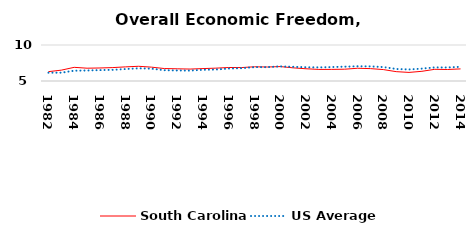
| Category | South Carolina | US Average |
|---|---|---|
| 1982.0 | 6.299 | 6.149 |
| 1983.0 | 6.507 | 6.152 |
| 1984.0 | 6.897 | 6.429 |
| 1985.0 | 6.779 | 6.464 |
| 1986.0 | 6.808 | 6.512 |
| 1987.0 | 6.862 | 6.552 |
| 1988.0 | 6.963 | 6.659 |
| 1989.0 | 7.043 | 6.767 |
| 1990.0 | 6.924 | 6.71 |
| 1991.0 | 6.731 | 6.502 |
| 1992.0 | 6.693 | 6.463 |
| 1993.0 | 6.656 | 6.446 |
| 1994.0 | 6.724 | 6.563 |
| 1995.0 | 6.784 | 6.593 |
| 1996.0 | 6.875 | 6.73 |
| 1997.0 | 6.865 | 6.781 |
| 1998.0 | 6.975 | 6.926 |
| 1999.0 | 6.944 | 6.925 |
| 2000.0 | 7.004 | 7.031 |
| 2001.0 | 6.826 | 6.969 |
| 2002.0 | 6.699 | 6.912 |
| 2003.0 | 6.608 | 6.892 |
| 2004.0 | 6.614 | 6.934 |
| 2005.0 | 6.638 | 6.99 |
| 2006.0 | 6.769 | 7.048 |
| 2007.0 | 6.719 | 7.028 |
| 2008.0 | 6.588 | 6.935 |
| 2009.0 | 6.299 | 6.668 |
| 2010.0 | 6.193 | 6.605 |
| 2011.0 | 6.346 | 6.72 |
| 2012.0 | 6.624 | 6.883 |
| 2013.0 | 6.597 | 6.881 |
| 2014.0 | 6.68 | 6.973 |